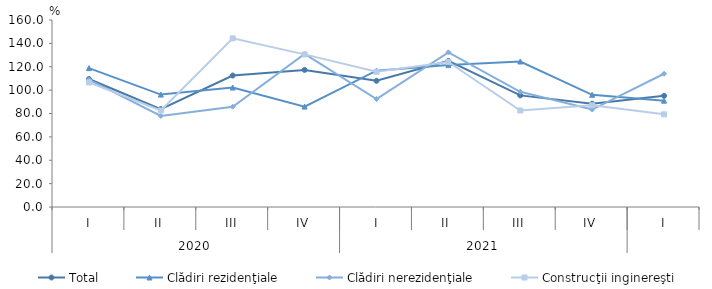
| Category | Total | Clădiri rezidenţiale | Clădiri nerezidenţiale | Construcţii inginereşti |
|---|---|---|---|---|
| 0 | 109.5 | 118.8 | 108.9 | 106.6 |
| 1 | 83.8 | 96.2 | 77.9 | 82.6 |
| 2 | 112.5 | 102.2 | 85.8 | 144.3 |
| 3 | 117.3 | 85.9 | 130.9 | 130.6 |
| 4 | 108 | 116.6 | 92.4 | 115.7 |
| 5 | 125 | 121.4 | 132.3 | 124.1 |
| 6 | 95.5 | 124.5 | 98.6 | 82.6 |
| 7 | 88.4 | 96 | 83.4 | 87 |
| 8 | 95.1 | 91 | 114 | 79.3 |